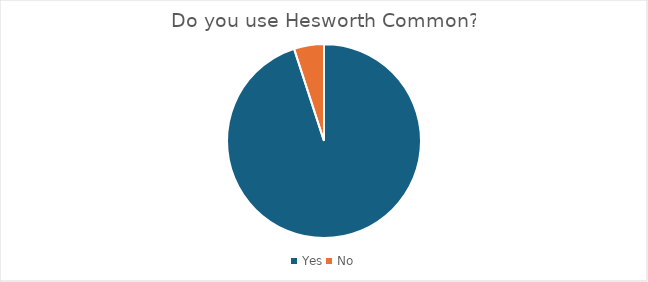
| Category | Series 0 |
|---|---|
| Yes | 19 |
| No | 1 |